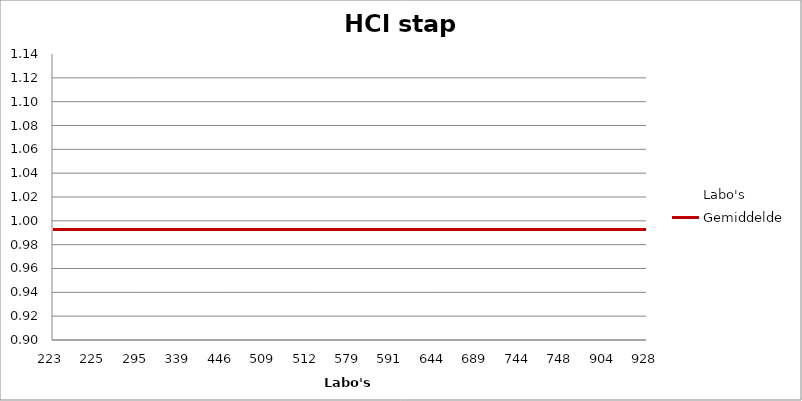
| Category | Labo's | Gemiddelde |
|---|---|---|
| 223.0 | 0.923 | 0.993 |
| 225.0 | 1.116 | 0.993 |
| 295.0 | 0.946 | 0.993 |
| 339.0 | 0.991 | 0.993 |
| 446.0 | 1.067 | 0.993 |
| 509.0 | 1.017 | 0.993 |
| 512.0 | 0.997 | 0.993 |
| 579.0 | 0.97 | 0.993 |
| 591.0 | 1.036 | 0.993 |
| 644.0 | 0.943 | 0.993 |
| 689.0 | 0.949 | 0.993 |
| 744.0 | 0.99 | 0.993 |
| 748.0 | 0.967 | 0.993 |
| 904.0 | 1.003 | 0.993 |
| 928.0 | 1.022 | 0.993 |